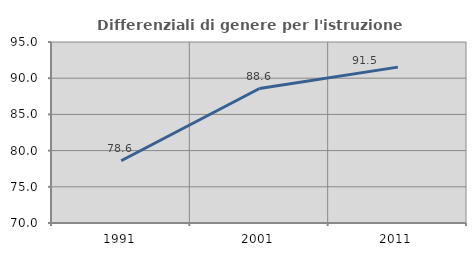
| Category | Differenziali di genere per l'istruzione superiore |
|---|---|
| 1991.0 | 78.604 |
| 2001.0 | 88.572 |
| 2011.0 | 91.53 |